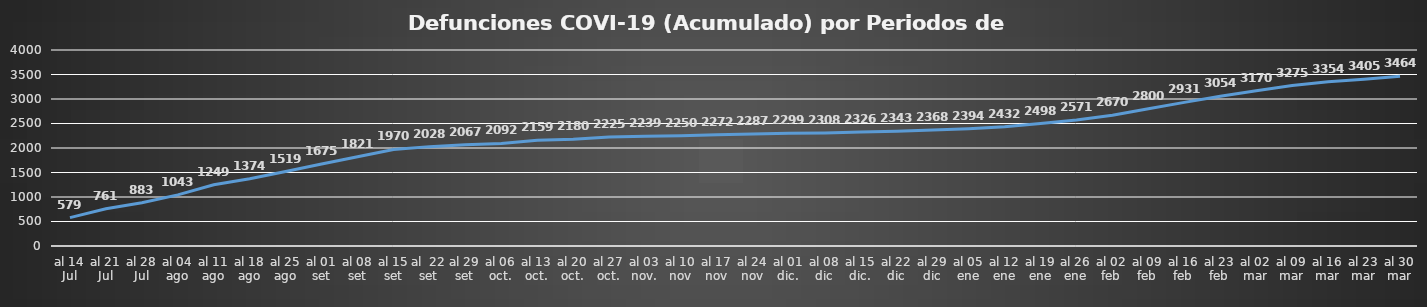
| Category | Series 0 |
|---|---|
| al 14 Jul | 579 |
| al 21 Jul | 761 |
| al 28 Jul | 883 |
| al 04 ago | 1043 |
| al 11 ago | 1249 |
| al 18 ago | 1374 |
| al 25 ago | 1519 |
| al 01 set | 1675 |
| al 08 set | 1821 |
| al 15 set | 1970 |
| al  22 set | 2028 |
| al 29 set | 2067 |
| al 06 oct. | 2092 |
| al 13 oct. | 2159 |
| al 20 oct. | 2180 |
| al 27 oct. | 2225 |
| al 03 nov. | 2239 |
| al 10 nov | 2250 |
| al 17 nov | 2272 |
| al 24 nov | 2287 |
| al 01 dic. | 2299 |
| al 08 dic | 2308 |
| al 15 dic. | 2326 |
| al 22 dic | 2343 |
| al 29 dic | 2368 |
| al 05 ene | 2394 |
| al 12 ene | 2432 |
| al 19 ene | 2498 |
| al 26 ene | 2571 |
| al 02 feb | 2670 |
| al 09 feb | 2800 |
| al 16 feb | 2931 |
| al 23 feb | 3054 |
| al 02 mar | 3170 |
| al 09 mar | 3275 |
| al 16 mar | 3354 |
| al 23 mar | 3405 |
| al 30 mar | 3464 |